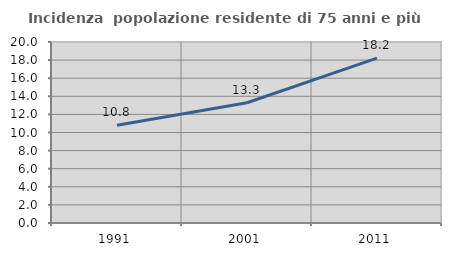
| Category | Incidenza  popolazione residente di 75 anni e più |
|---|---|
| 1991.0 | 10.797 |
| 2001.0 | 13.291 |
| 2011.0 | 18.221 |